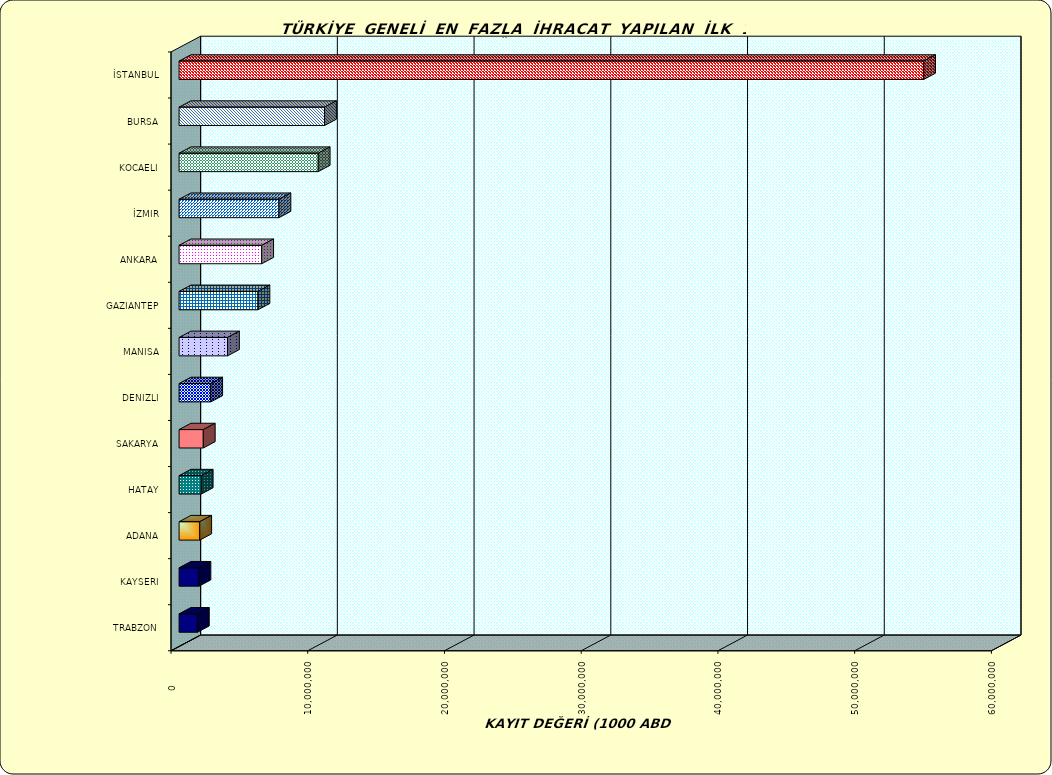
| Category | Series 0 |
|---|---|
| İSTANBUL | 54456445.805 |
| BURSA | 10638711.633 |
| KOCAELI | 10177615.013 |
| İZMIR | 7305866.218 |
| ANKARA | 6043060.42 |
| GAZIANTEP | 5770717.039 |
| MANISA | 3542837.552 |
| DENIZLI | 2314489.992 |
| SAKARYA | 1770249.321 |
| HATAY | 1621730.699 |
| ADANA | 1512633.993 |
| KAYSERI | 1455200.7 |
| TRABZON | 1340182.117 |